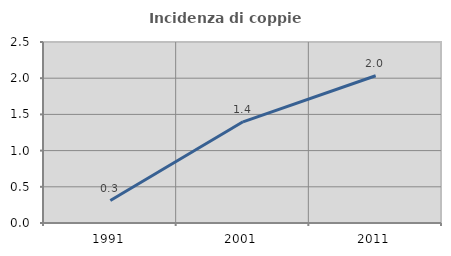
| Category | Incidenza di coppie miste |
|---|---|
| 1991.0 | 0.31 |
| 2001.0 | 1.397 |
| 2011.0 | 2.034 |